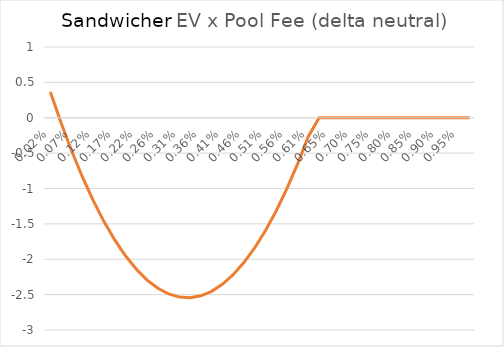
| Category | Searcher EV / User Volume  x Pool Fee |
|---|---|
| 0.0002 | 0.363 |
| 0.00044400000000000006 | -0.075 |
| 0.000688 | -0.478 |
| 0.0009320000000000001 | -0.845 |
| 0.0011760000000000002 | -1.176 |
| 0.0014200000000000003 | -1.471 |
| 0.0016640000000000003 | -1.731 |
| 0.0019080000000000004 | -1.954 |
| 0.0021520000000000003 | -2.142 |
| 0.002396 | -2.294 |
| 0.00264 | -2.41 |
| 0.002884 | -2.491 |
| 0.0031279999999999997 | -2.535 |
| 0.0033719999999999996 | -2.544 |
| 0.0036159999999999994 | -2.516 |
| 0.0038599999999999993 | -2.453 |
| 0.004103999999999999 | -2.354 |
| 0.0043479999999999994 | -2.219 |
| 0.004592 | -2.048 |
| 0.004836 | -1.84 |
| 0.00508 | -1.597 |
| 0.005324000000000001 | -1.318 |
| 0.005568000000000001 | -1.003 |
| 0.005812000000000001 | -0.652 |
| 0.0060560000000000015 | -0.265 |
| 0.006300000000000002 | 0 |
| 0.006544000000000002 | 0 |
| 0.006788000000000002 | 0 |
| 0.007032000000000003 | 0 |
| 0.007276000000000003 | 0 |
| 0.007520000000000003 | 0 |
| 0.0077640000000000035 | 0 |
| 0.008008000000000003 | 0 |
| 0.008252000000000002 | 0 |
| 0.008496000000000002 | 0 |
| 0.008740000000000001 | 0 |
| 0.008984 | 0 |
| 0.009228 | 0 |
| 0.009472 | 0 |
| 0.009715999999999999 | 0 |